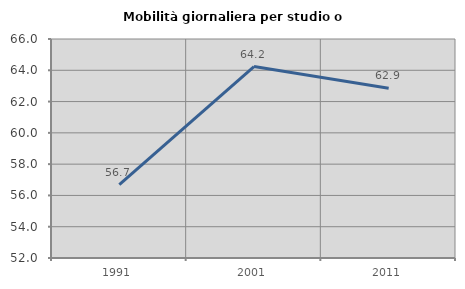
| Category | Mobilità giornaliera per studio o lavoro |
|---|---|
| 1991.0 | 56.697 |
| 2001.0 | 64.239 |
| 2011.0 | 62.852 |